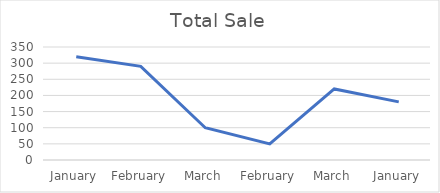
| Category | Total Sale |
|---|---|
| January | 320 |
| February | 290 |
| March | 100 |
| February | 50 |
| March | 220 |
| January | 180 |